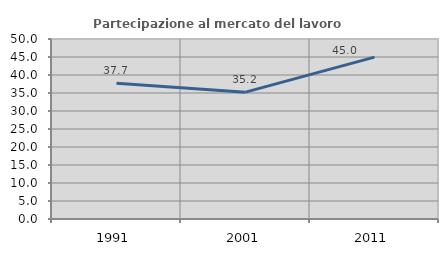
| Category | Partecipazione al mercato del lavoro  femminile |
|---|---|
| 1991.0 | 37.683 |
| 2001.0 | 35.229 |
| 2011.0 | 44.96 |